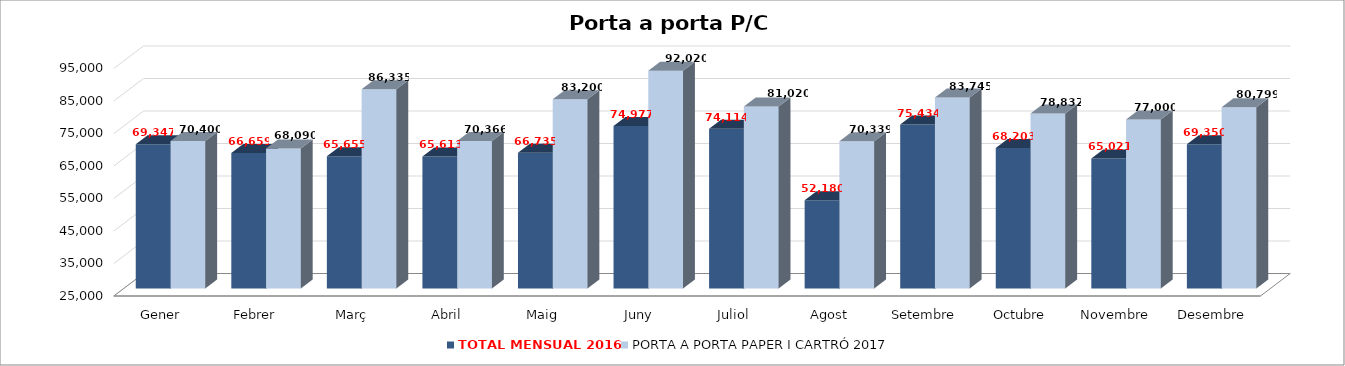
| Category | TOTAL MENSUAL 2016 | PORTA A PORTA PAPER I CARTRÓ 2017 |
|---|---|---|
| Gener | 69346.84 | 70400 |
| Febrer | 66658.75 | 68090 |
| Març | 65655.07 | 86335.45 |
| Abril | 65612.8 | 70366.32 |
| Maig | 66735.39 | 83200 |
| Juny | 74976.85 | 92020 |
| Juliol | 74114.47 | 81020 |
| Agost | 52179.54 | 70339 |
| Setembre | 75433.67 | 83745.14 |
| Octubre | 68203.14 | 78831.82 |
| Novembre | 65021 | 77000 |
| Desembre | 69350 | 80799 |